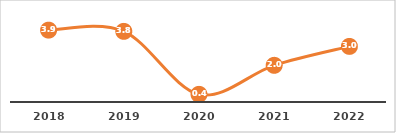
| Category | COBERTURA DE BECADOS EXTERNOS (%) |
|---|---|
| 2018.0 | 3.906 |
| 2019.0 | 3.839 |
| 2020.0 | 0.416 |
| 2021.0 | 1.993 |
| 2022.0 | 3.022 |